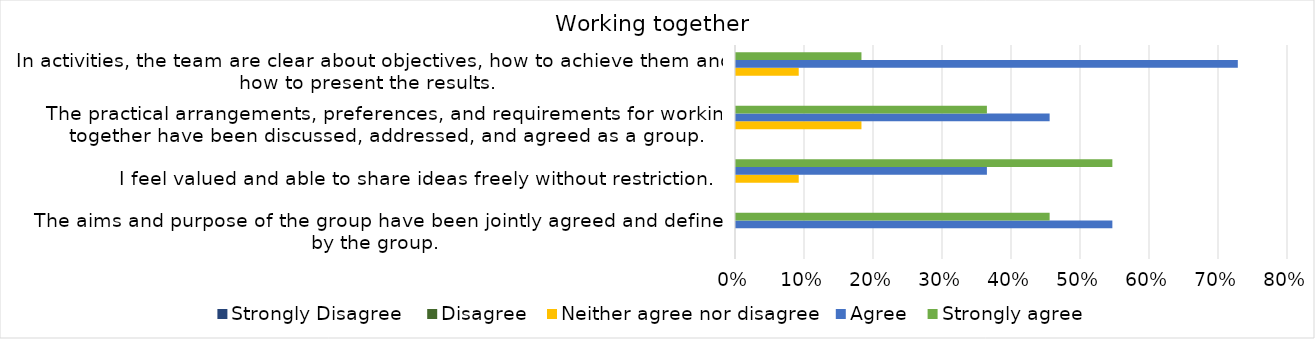
| Category | Strongly Disagree 
 | Disagree
 | Neither agree nor disagree
 | Agree
 | Strongly agree
 |
|---|---|---|---|---|---|
| The aims and purpose of the group have been jointly agreed and defined by the group. 
 | 0 | 0 | 0 | 0.545 | 0.455 |
| I feel valued and able to share ideas freely without restriction. 
 | 0 | 0 | 0.091 | 0.364 | 0.545 |
| The practical arrangements, preferences, and requirements for working together have been discussed, addressed, and agreed as a group. 
 | 0 | 0 | 0.182 | 0.455 | 0.364 |
| In activities, the team are clear about objectives, how to achieve them and how to present the results. 
 | 0 | 0 | 0.091 | 0.727 | 0.182 |